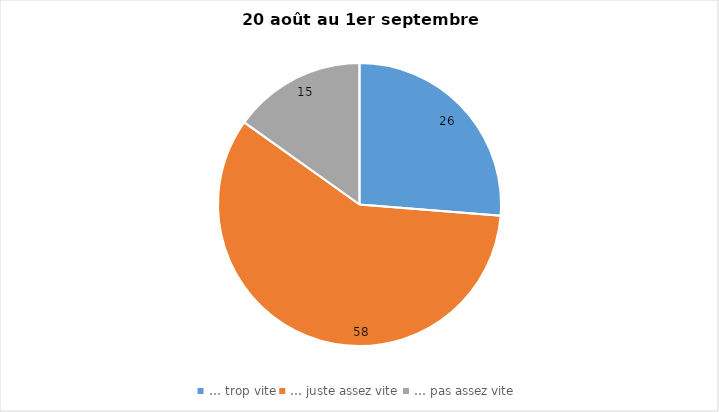
| Category | Series 0 |
|---|---|
| … trop vite | 26 |
| … juste assez vite | 58 |
| … pas assez vite | 15 |